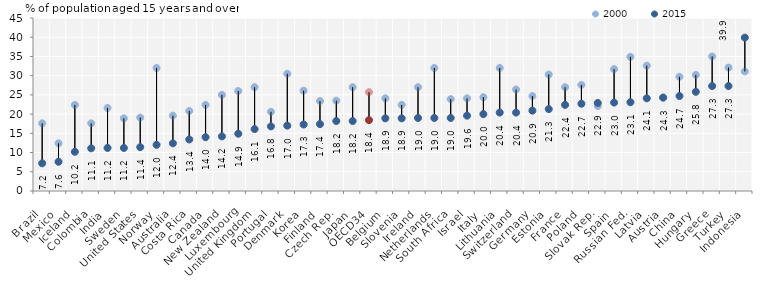
| Category | 2000 | 2015 |
|---|---|---|
| Brazil | 17.6 | 7.2 |
| Mexico | 12.4 | 7.6 |
| Iceland | 22.4 | 10.2 |
| Colombia | 17.6 | 11.1 |
| India | 21.6 | 11.2 |
| Sweden | 18.9 | 11.2 |
| United States | 19.1 | 11.4 |
| Norway | 32 | 12 |
| Australia | 19.6 | 12.4 |
| Costa Rica | 20.8 | 13.4 |
| Canada | 22.4 | 14 |
| New Zealand | 25 | 14.2 |
| Luxembourg | 26 | 14.9 |
| United Kingdom | 27 | 16.1 |
| Portugal | 20.6 | 16.8 |
| Denmark | 30.5 | 17 |
| Korea | 26.1 | 17.3 |
| Finland | 23.4 | 17.4 |
| Czech Rep. | 23.5 | 18.2 |
| Japan | 27 | 18.2 |
| OECD34 | 25.703 | 18.432 |
| Belgium | 24.1 | 18.9 |
| Slovenia | 22.4 | 18.9 |
| Ireland | 27 | 19 |
| Netherlands | 32 | 19 |
| South Africa | 23.9 | 19 |
| Israel | 24.1 | 19.6 |
| Italy | 24.4 | 20 |
| Lithuania | 32 | 20.4 |
| Switzerland | 26.4 | 20.4 |
| Germany | 24.7 | 20.9 |
| Estonia | 30.3 | 21.3 |
| France | 27 | 22.4 |
| Poland | 27.6 | 22.7 |
| Slovak Rep. | 22.1 | 22.9 |
| Spain | 31.7 | 23 |
| Russian Fed. | 34.9 | 23.1 |
| Latvia | 32.6 | 24.1 |
| Austria | 24.3 | 24.3 |
| China | 29.7 | 24.7 |
| Hungary | 30.2 | 25.8 |
| Greece | 35 | 27.3 |
| Turkey | 32.1 | 27.3 |
| Indonesia | 31.1 | 39.9 |